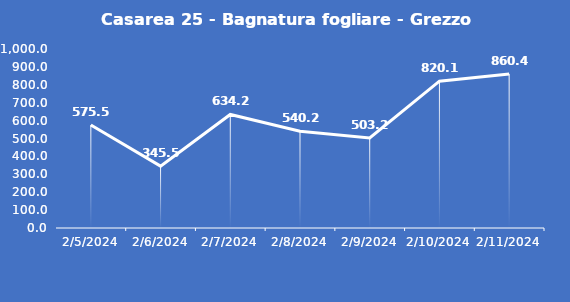
| Category | Casarea 25 - Bagnatura fogliare - Grezzo (min) |
|---|---|
| 2/5/24 | 575.5 |
| 2/6/24 | 345.5 |
| 2/7/24 | 634.2 |
| 2/8/24 | 540.2 |
| 2/9/24 | 503.2 |
| 2/10/24 | 820.1 |
| 2/11/24 | 860.4 |